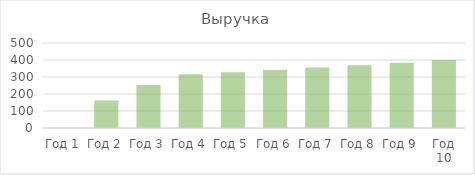
| Category | Выручка |
|---|---|
| Год 1 | 0 |
| Год 2 | 162.24 |
| Год 3 | 253.094 |
| Год 4 | 315.862 |
| Год 5 | 328.496 |
| Год 6 | 341.636 |
| Год 7 | 355.302 |
| Год 8 | 369.514 |
| Год 9 | 384.294 |
| Год 10 | 399.666 |